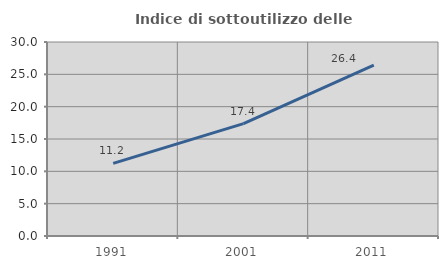
| Category | Indice di sottoutilizzo delle abitazioni  |
|---|---|
| 1991.0 | 11.236 |
| 2001.0 | 17.371 |
| 2011.0 | 26.407 |